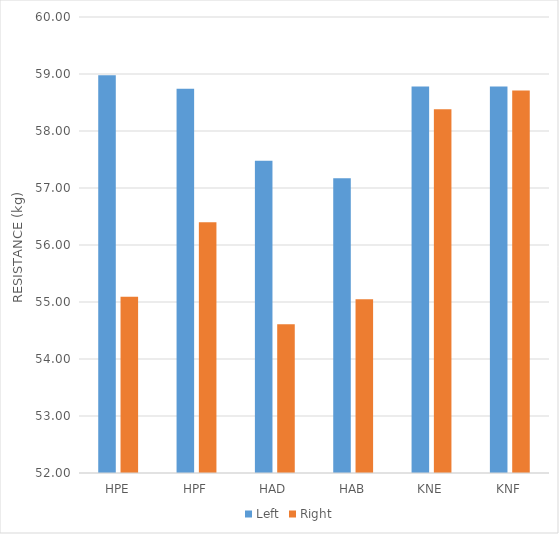
| Category | Left | Right |
|---|---|---|
| HPE | 58.98 | 55.09 |
| HPF | 58.74 | 56.4 |
| HAD | 57.48 | 54.61 |
| HAB | 57.17 | 55.05 |
| KNE | 58.78 | 58.38 |
| KNF | 58.78 | 58.71 |